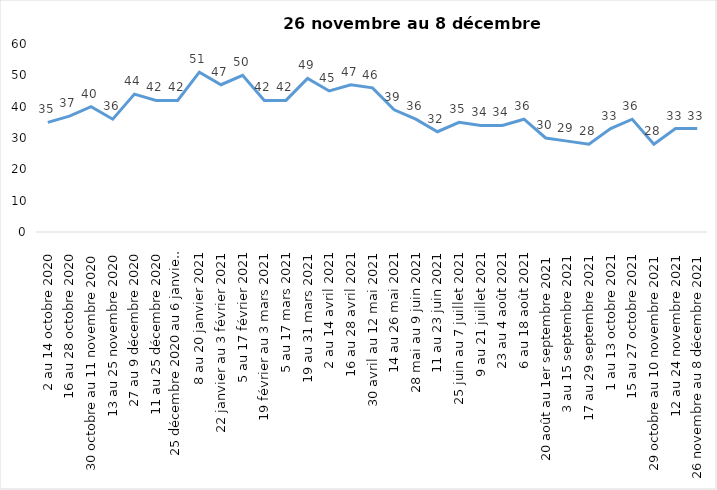
| Category | Toujours aux trois mesures |
|---|---|
| 2 au 14 octobre 2020 | 35 |
| 16 au 28 octobre 2020 | 37 |
| 30 octobre au 11 novembre 2020 | 40 |
| 13 au 25 novembre 2020 | 36 |
| 27 au 9 décembre 2020 | 44 |
| 11 au 25 décembre 2020 | 42 |
| 25 décembre 2020 au 6 janvier 2021 | 42 |
| 8 au 20 janvier 2021 | 51 |
| 22 janvier au 3 février 2021 | 47 |
| 5 au 17 février 2021 | 50 |
| 19 février au 3 mars 2021 | 42 |
| 5 au 17 mars 2021 | 42 |
| 19 au 31 mars 2021 | 49 |
| 2 au 14 avril 2021 | 45 |
| 16 au 28 avril 2021 | 47 |
| 30 avril au 12 mai 2021 | 46 |
| 14 au 26 mai 2021 | 39 |
| 28 mai au 9 juin 2021 | 36 |
| 11 au 23 juin 2021 | 32 |
| 25 juin au 7 juillet 2021 | 35 |
| 9 au 21 juillet 2021 | 34 |
| 23 au 4 août 2021 | 34 |
| 6 au 18 août 2021 | 36 |
| 20 août au 1er septembre 2021 | 30 |
| 3 au 15 septembre 2021 | 29 |
| 17 au 29 septembre 2021 | 28 |
| 1 au 13 octobre 2021 | 33 |
| 15 au 27 octobre 2021 | 36 |
| 29 octobre au 10 novembre 2021 | 28 |
| 12 au 24 novembre 2021 | 33 |
| 26 novembre au 8 décembre 2021 | 33 |